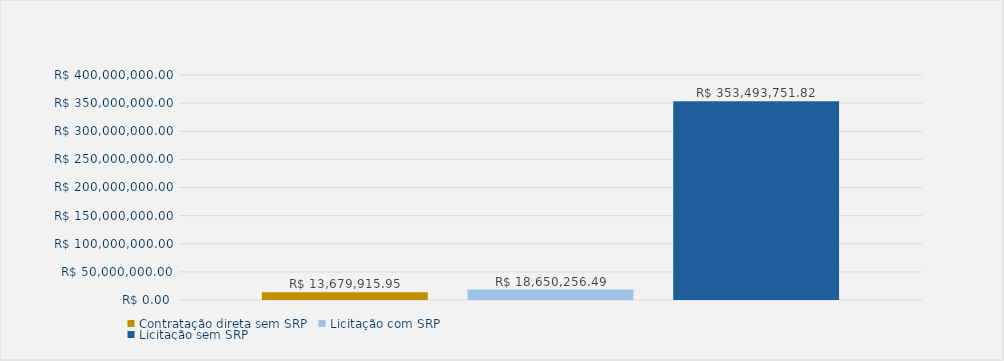
| Category | Contratação direta sem SRP | Licitação com SRP | Licitação sem SRP |
|---|---|---|---|
| Total | 13679915.95 | 18650256.49 | 353493751.82 |